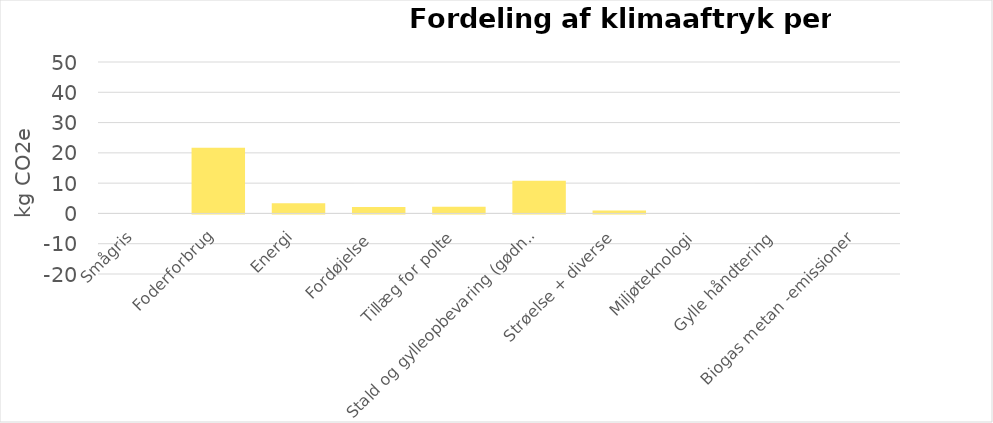
| Category | Smågris |
|---|---|
| Smågris | 0 |
| Foderforbrug | 21.684 |
| Energi | 3.4 |
| Fordøjelse  | 2.1 |
| Tillæg for polte | 2.203 |
| Stald og gylleopbevaring (gødninmgsproduktion) | 10.8 |
| Strøelse + diverse | 1 |
| Miljøteknologi | 0 |
| Gylle håndtering | 0 |
| Biogas metan -emissioner | 0 |